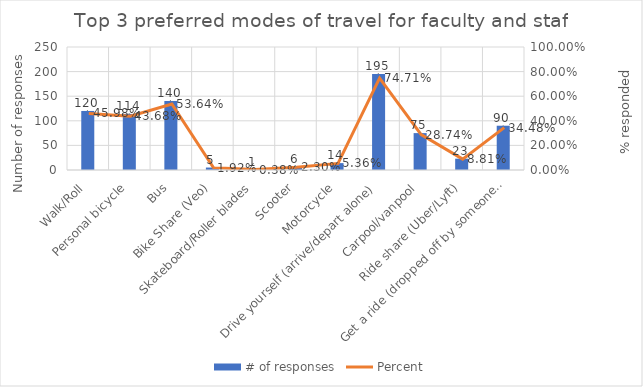
| Category | # of responses |
|---|---|
| Walk/Roll | 120 |
| Personal bicycle | 114 |
| Bus | 140 |
| Bike Share (Veo) | 5 |
| Skateboard/Roller blades | 1 |
| Scooter | 6 |
| Motorcycle | 14 |
| Drive yourself (arrive/depart alone) | 195 |
| Carpool/vanpool | 75 |
| Ride share (Uber/Lyft) | 23 |
| Get a ride (dropped off by someone who goes elsewhere... not in campus | 90 |